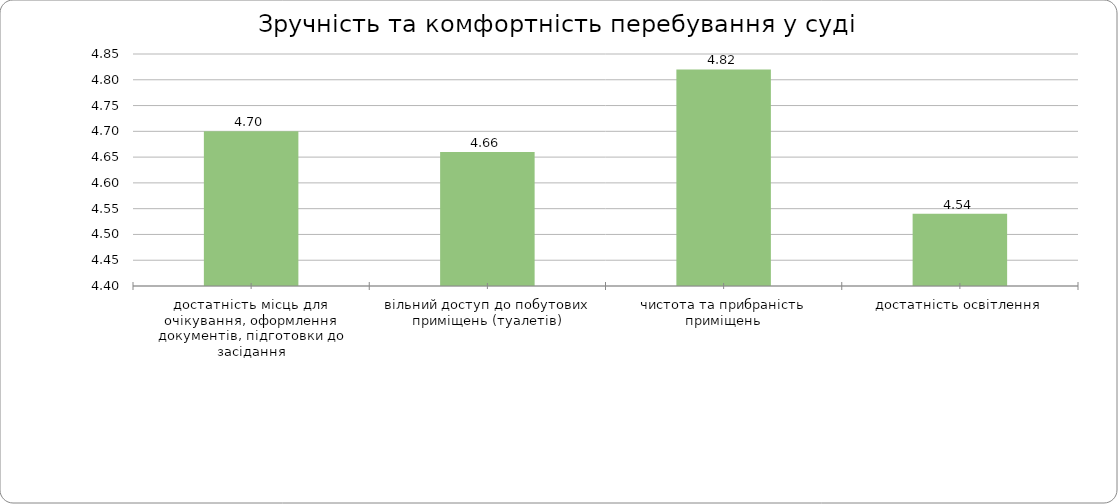
| Category | Series 0 |
|---|---|
| достатність місць для очікування, оформлення документів, підготовки до засідання | 4.7 |
| вільний доступ до побутових приміщень (туалетів) | 4.66 |
| чистота та прибраність приміщень | 4.82 |
| достатність освітлення | 4.54 |